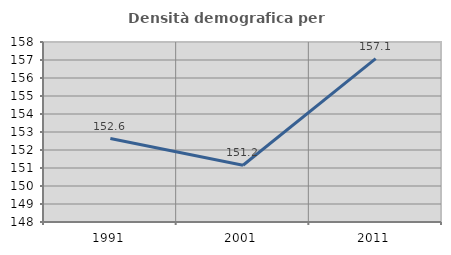
| Category | Densità demografica |
|---|---|
| 1991.0 | 152.635 |
| 2001.0 | 151.154 |
| 2011.0 | 157.079 |